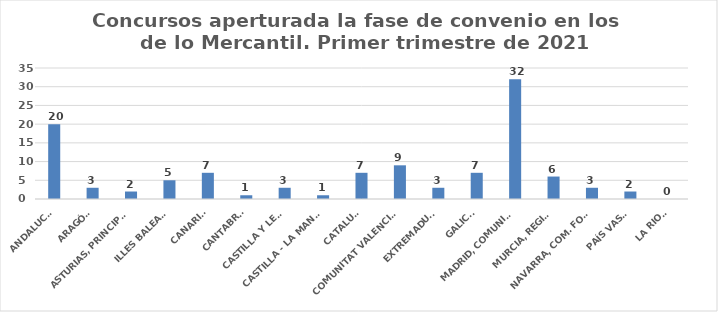
| Category | Series 0 |
|---|---|
| ANDALUCÍA | 20 |
| ARAGÓN | 3 |
| ASTURIAS, PRINCIPADO | 2 |
| ILLES BALEARS | 5 |
| CANARIAS | 7 |
| CANTABRIA | 1 |
| CASTILLA Y LEÓN | 3 |
| CASTILLA - LA MANCHA | 1 |
| CATALUÑA | 7 |
| COMUNITAT VALENCIANA | 9 |
| EXTREMADURA | 3 |
| GALICIA | 7 |
| MADRID, COMUNIDAD | 32 |
| MURCIA, REGIÓN | 6 |
| NAVARRA, COM. FORAL | 3 |
| PAÍS VASCO | 2 |
| LA RIOJA | 0 |